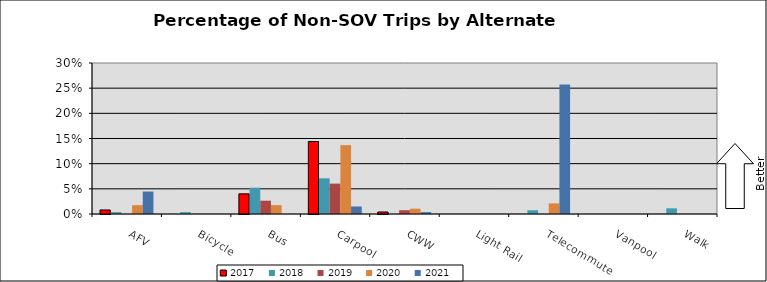
| Category | 2017 | 2018 | 2019 | 2020 | 2021 |
|---|---|---|---|---|---|
| AFV | 0.008 | 0.004 | 0 | 0.018 | 0.045 |
| Bicycle | 0 | 0.004 | 0 | 0 | 0 |
| Bus | 0.04 | 0.052 | 0.026 | 0.018 | 0 |
| Carpool | 0.144 | 0.071 | 0.06 | 0.137 | 0.015 |
| CWW | 0.004 | 0 | 0.008 | 0.011 | 0.004 |
| Light Rail | 0 | 0 | 0 | 0 | 0 |
| Telecommute | 0 | 0.007 | 0 | 0.021 | 0.257 |
| Vanpool | 0 | 0 | 0 | 0 | 0 |
| Walk | 0 | 0.011 | 0 | 0 | 0 |